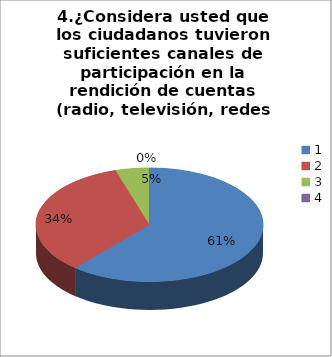
| Category | Series 0 |
|---|---|
| 0 | 38 |
| 1 | 21 |
| 2 | 3 |
| 3 | 0 |